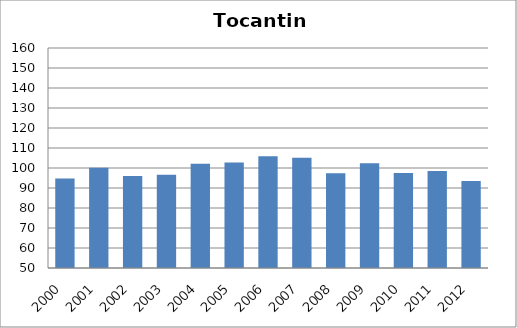
| Category | Hepatite B |
|---|---|
| 2000.0 | 94.71 |
| 2001.0 | 100.11 |
| 2002.0 | 95.97 |
| 2003.0 | 96.67 |
| 2004.0 | 102.12 |
| 2005.0 | 102.76 |
| 2006.0 | 105.93 |
| 2007.0 | 105.1 |
| 2008.0 | 97.43 |
| 2009.0 | 102.36 |
| 2010.0 | 97.54 |
| 2011.0 | 98.55 |
| 2012.0 | 93.49 |